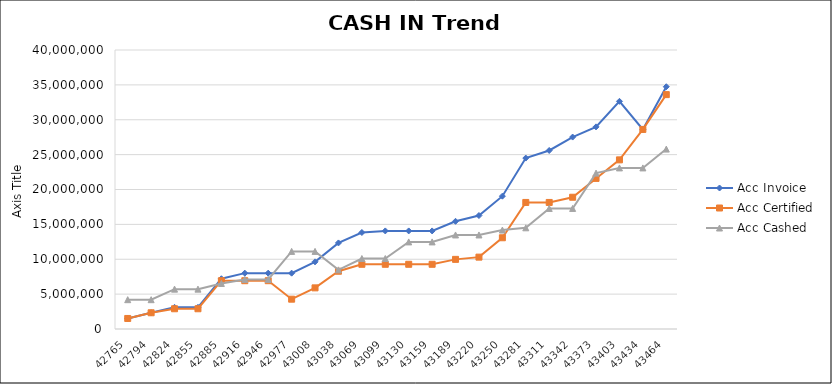
| Category | Acc Invoice | Acc Certified | Acc Cashed |
|---|---|---|---|
| 2017-01-30 | 1510832.817 | 1510832.817 | 4204461.15 |
| 2017-02-28 | 2326502.227 | 2326502.232 | 4204461.15 |
| 2017-03-30 | 3108541.306 | 2901952.575 | 5715293.967 |
| 2017-04-30 | 3108541.306 | 2901952.575 | 5715293.967 |
| 2017-05-30 | 7205788.102 | 6923780.172 | 6530963.382 |
| 2017-06-30 | 8007271.692 | 6923780.172 | 7106413.725 |
| 2017-07-30 | 8007271.692 | 6923780.172 | 7106413.725 |
| 2017-08-30 | 8007271.692 | 4274975.822 | 11128241.322 |
| 2017-09-30 | 9630294.242 | 5897998.376 | 11128241.322 |
| 2017-10-30 | 12339887.767 | 8279900.894 | 8479436.972 |
| 2017-11-30 | 13839458.971 | 9277941.323 | 10102459.526 |
| 2017-12-30 | 14061046.416 | 9277941.323 | 10102459.526 |
| 2018-01-30 | 14061046.416 | 9277941.323 | 12484362.048 |
| 2018-02-28 | 14061046.416 | 9277941.323 | 12484362.048 |
| 2018-03-30 | 15440247.42 | 9982350.965 | 13482402.477 |
| 2018-04-30 | 16266885.679 | 10304624.201 | 13482402.477 |
| 2018-05-30 | 19043469.459 | 13081207.981 | 14186812.119 |
| 2018-06-30 | 24506254.219 | 18144041.314 | 14509085.355 |
| 2018-07-30 | 25596545.269 | 18144041.314 | 17285669.135 |
| 2018-08-30 | 27515921.774 | 18890753.454 | 17285669.135 |
| 2018-09-30 | 28977564.134 | 21589279.992 | 22348502.468 |
| 2018-10-30 | 32642183.748 | 24248644.137 | 23095214.608 |
| 2018-11-30 | 28613611 | 28613611.005 | 23095214.608 |
| 2018-12-30 | 34732811.517 | 33603179.911 | 25793741.146 |